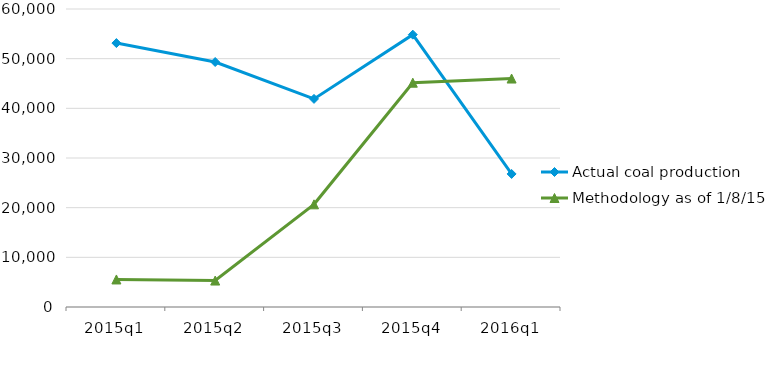
| Category | Actual coal production | Methodology as of 1/8/15 |
|---|---|---|
| 2015q1 | 53137 | 5545 |
| 2015q2 | 49327 | 5326 |
| 2015q3 | 41902 | 20674 |
| 2015q4 | 54833 | 45161 |
| 2016q1 | 26788 | 45999 |